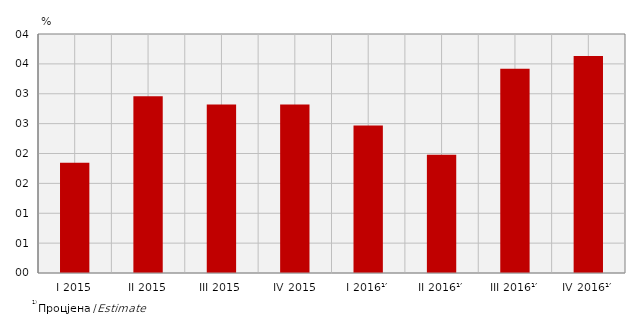
| Category | Стопе реалног раста БДП-а
Real growth rates of GDP |
|---|---|
| I 2015 | 1.844 |
| II 2015 | 2.959 |
| III 2015 | 2.821 |
| IV 2015 | 2.82 |
| I 2016¹′ | 2.467 |
| II 2016¹′ | 1.98 |
| III 2016¹′ | 3.42 |
| IV 2016¹′ | 3.633 |